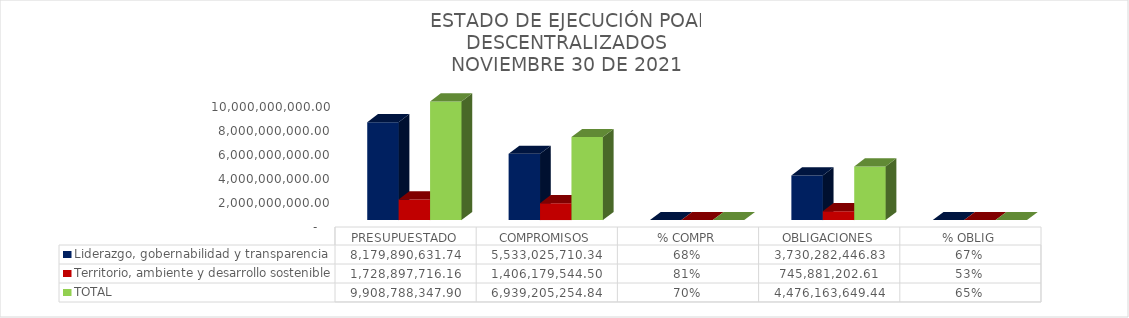
| Category | Liderazgo, gobernabilidad y transparencia | Territorio, ambiente y desarrollo sostenible | TOTAL |
|---|---|---|---|
|  PRESUPUESTADO  | 8179890631.74 | 1728897716.16 | 9908788347.9 |
|  COMPROMISOS  | 5533025710.34 | 1406179544.5 | 6939205254.84 |
|  % COMPR  | 0.676 | 0.813 | 0.7 |
|  OBLIGACIONES  | 3730282446.83 | 745881202.61 | 4476163649.44 |
|  % OBLIG  | 0.674 | 0.53 | 0.645 |